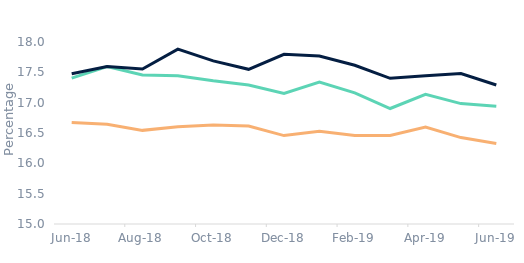
| Category | First-time
buyers | Homemovers | Remortgagors |
|---|---|---|---|
| 2018-06-01 | 17.405 | 17.476 | 16.672 |
| 2018-07-01 | 17.595 | 17.596 | 16.644 |
| 2018-08-01 | 17.456 | 17.554 | 16.543 |
| 2018-09-01 | 17.444 | 17.883 | 16.604 |
| 2018-10-01 | 17.36 | 17.689 | 16.63 |
| 2018-11-01 | 17.29 | 17.55 | 16.616 |
| 2018-12-01 | 17.152 | 17.798 | 16.457 |
| 2019-01-01 | 17.341 | 17.77 | 16.529 |
| 2019-02-01 | 17.162 | 17.616 | 16.46 |
| 2019-03-01 | 16.904 | 17.401 | 16.46 |
| 2019-04-01 | 17.137 | 17.443 | 16.597 |
| 2019-05-01 | 16.985 | 17.481 | 16.424 |
| 2019-06-01 | 16.94 | 17.291 | 16.328 |